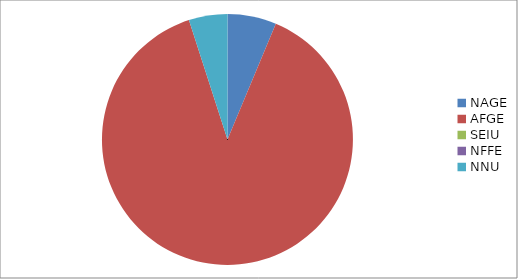
| Category | Series 0 |
|---|---|
| NAGE | 872 |
| AFGE | 12294 |
| SEIU | 0 |
| NFFE | 0 |
| NNU | 689 |